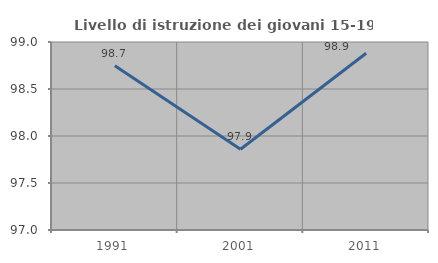
| Category | Livello di istruzione dei giovani 15-19 anni |
|---|---|
| 1991.0 | 98.748 |
| 2001.0 | 97.859 |
| 2011.0 | 98.881 |